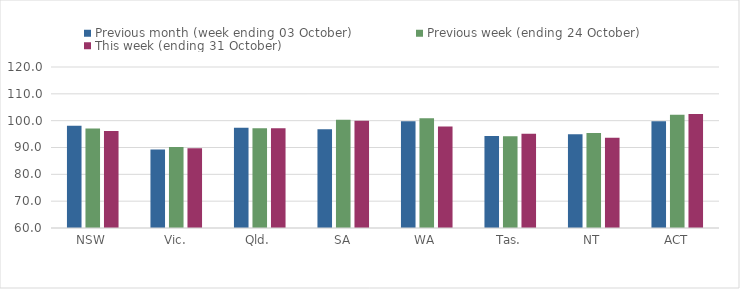
| Category | Previous month (week ending 03 October) | Previous week (ending 24 October) | This week (ending 31 October) |
|---|---|---|---|
| NSW | 98.13 | 97.05 | 96.19 |
| Vic. | 89.27 | 90.17 | 89.73 |
| Qld. | 97.36 | 97.15 | 97.21 |
| SA | 96.84 | 100.37 | 99.94 |
| WA | 99.82 | 100.89 | 97.82 |
| Tas. | 94.25 | 94.2 | 95.13 |
| NT | 94.94 | 95.39 | 93.59 |
| ACT | 99.8 | 102.23 | 102.48 |